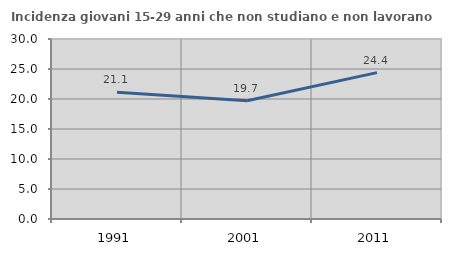
| Category | Incidenza giovani 15-29 anni che non studiano e non lavorano  |
|---|---|
| 1991.0 | 21.111 |
| 2001.0 | 19.697 |
| 2011.0 | 24.39 |